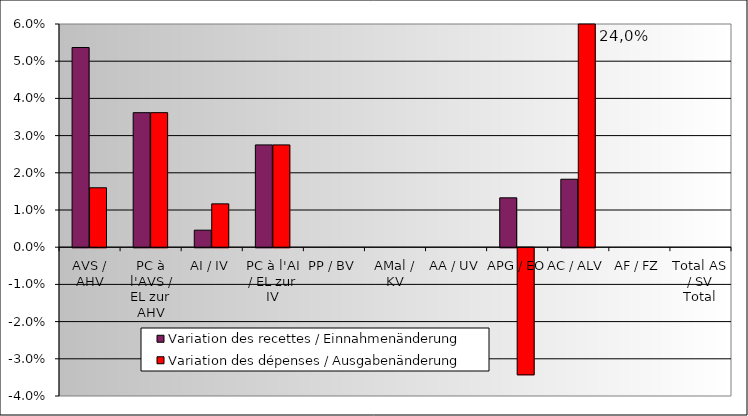
| Category | Variation des recettes / Einnahmenänderung | Variation des dépenses / Ausgabenänderung |
|---|---|---|
| AVS / AHV | 0.054 | 0.016 |
| PC à l'AVS / EL zur AHV | 0.036 | 0.036 |
| AI / IV | 0.005 | 0.012 |
| PC à l'AI / EL zur IV | 0.028 | 0.028 |
| PP / BV | 0 | 0 |
| AMal / KV | 0 | 0 |
| AA / UV | 0 | 0 |
| APG / EO | 0.013 | -0.034 |
| AC / ALV | 0.018 | 0.24 |
| AF / FZ | 0 | 0 |
| Total AS / SV Total | 0 | 0 |